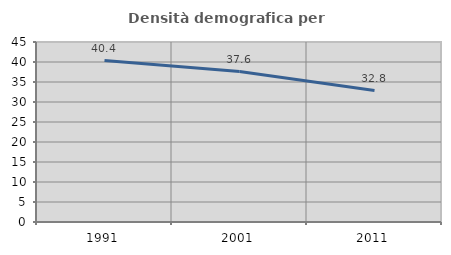
| Category | Densità demografica |
|---|---|
| 1991.0 | 40.354 |
| 2001.0 | 37.601 |
| 2011.0 | 32.848 |